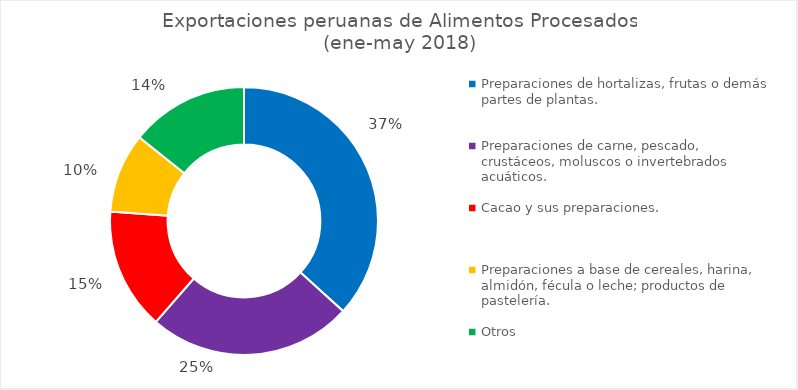
| Category | Series 0 |
|---|---|
| Preparaciones de hortalizas, frutas o demás partes de plantas. | 0.367 |
| Preparaciones de carne, pescado, crustáceos, moluscos o invertebrados acuáticos. | 0.247 |
| Cacao y sus preparaciones. | 0.147 |
| Preparaciones a base de cereales, harina, almidón, fécula o leche; productos de pastelería. | 0.096 |
| Otros | 0.143 |